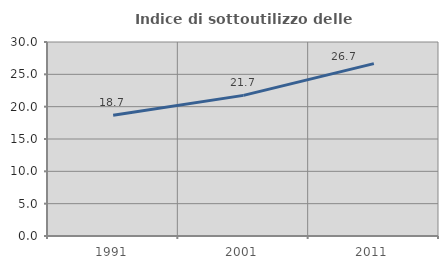
| Category | Indice di sottoutilizzo delle abitazioni  |
|---|---|
| 1991.0 | 18.681 |
| 2001.0 | 21.747 |
| 2011.0 | 26.657 |